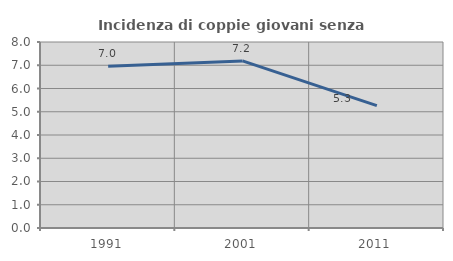
| Category | Incidenza di coppie giovani senza figli |
|---|---|
| 1991.0 | 6.955 |
| 2001.0 | 7.186 |
| 2011.0 | 5.266 |